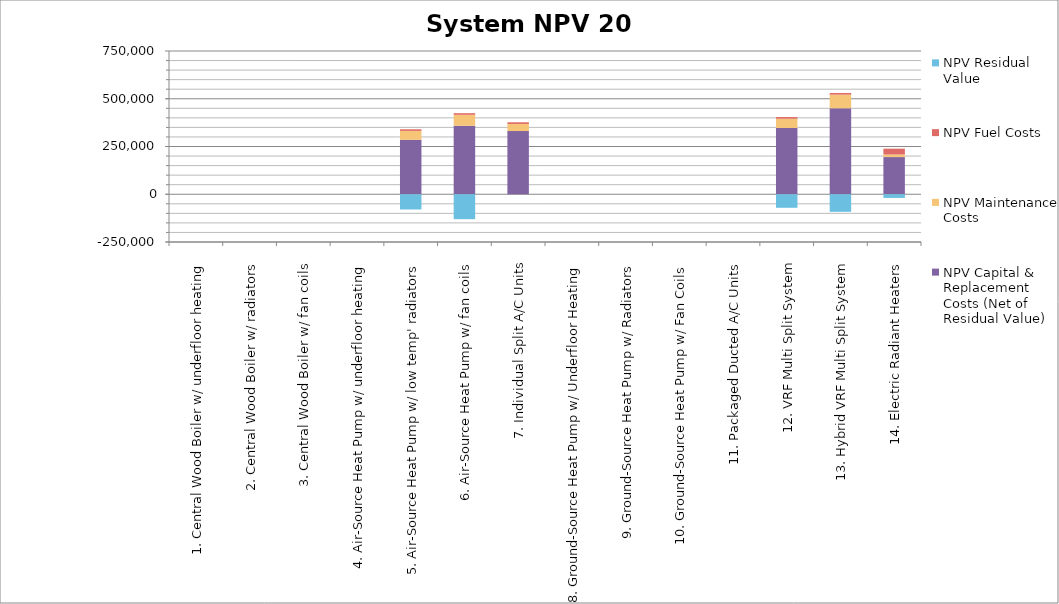
| Category | NPV Capital & Replacement Costs (Net of Residual Value) | NPV Maintenance Costs | NPV Fuel Costs | NPV Residual Value |
|---|---|---|---|---|
| 1. Central Wood Boiler w/ underfloor heating | 0 | 0 | 0 | 0 |
| 2. Central Wood Boiler w/ radiators | 0 | 0 | 0 | 0 |
| 3. Central Wood Boiler w/ fan coils | 0 | 0 | 0 | 0 |
| 4. Air-Source Heat Pump w/ underfloor heating | 0 | 0 | 0 | 0 |
| 5. Air-Source Heat Pump w/ low temp' radiators | 284906.676 | 46715.822 | 8578.115 | -79712.126 |
| 6. Air-Source Heat Pump w/ fan coils | 358573.386 | 57317.994 | 8578.115 | -130403.761 |
| 7. Individual Split A/C Units | 330852.217 | 37183.254 | 8762.59 | 0 |
| 8. Ground-Source Heat Pump w/ Underfloor Heating | 0 | 0 | 0 | 0 |
| 9. Ground-Source Heat Pump w/ Radiators | 0 | 0 | 0 | 0 |
| 10. Ground-Source Heat Pump w/ Fan Coils | 0 | 0 | 0 | 0 |
| 11. Packaged Ducted A/C Units | 0 | 0 | 0 | 0 |
| 12. VRF Multi Split System | 346791.599 | 48689.531 | 8578.115 | -70855.223 |
| 13. Hybrid VRF Multi Split System | 450091.224 | 71359.375 | 8578.115 | -91961.034 |
| 14. Electric Radiant Heaters | 194691.323 | 13294.659 | 30669.065 | -19346.993 |